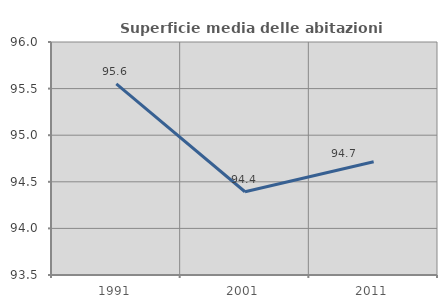
| Category | Superficie media delle abitazioni occupate |
|---|---|
| 1991.0 | 95.55 |
| 2001.0 | 94.393 |
| 2011.0 | 94.716 |